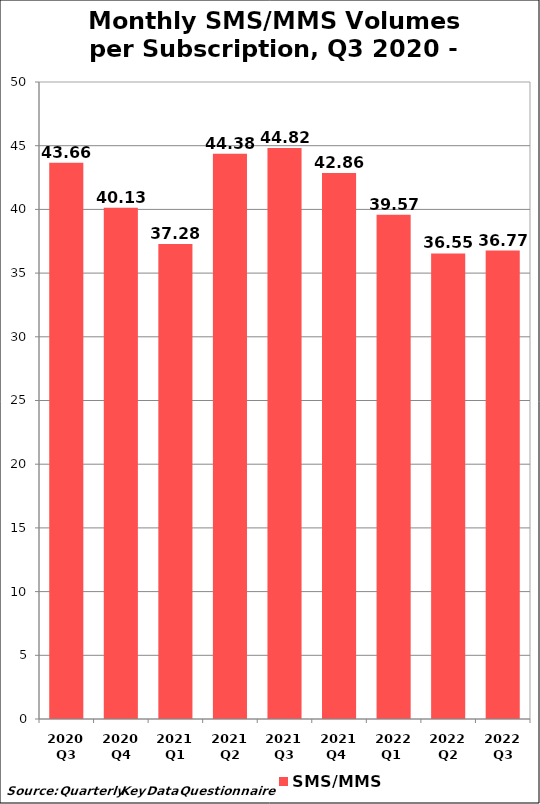
| Category | SMS/MMS |
|---|---|
| 2020 Q3 | 43.656 |
| 2020 Q4 | 40.134 |
| 2021 Q1 | 37.282 |
| 2021 Q2 | 44.376 |
| 2021 Q3 | 44.822 |
| 2021 Q4  | 42.864 |
| 2022 Q1  | 39.574 |
| 2022 Q2 | 36.546 |
| 2022 Q3 | 36.772 |